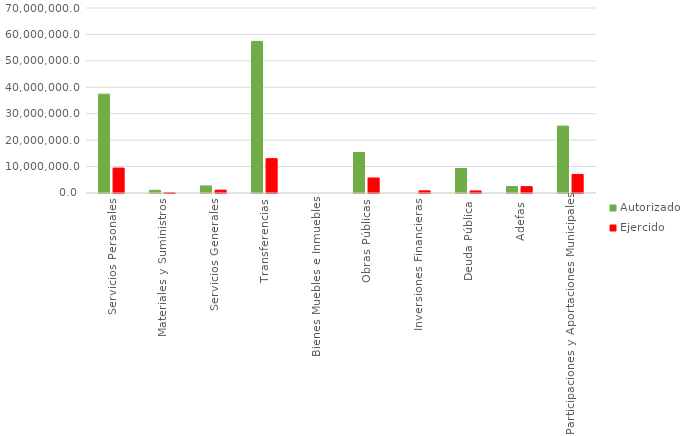
| Category | Autorizado | Ejercido |
|---|---|---|
| Servicios Personales | 37400976 | 9426853 |
| Materiales y Suministros | 1007654.6 | 62169 |
| Servicios Generales | 2671441.9 | 1088884.9 |
| Transferencias | 57359240.2 | 12991305.7 |
| Bienes Muebles e Inmuebles | 0 | 0 |
| Obras Públicas | 15340179.3 | 5679096.3 |
| Inversiones Financieras | 0 | 821471 |
| Deuda Pública | 9250255.7 | 777157.5 |
| Adefas | 2460661.3 | 2395757.3 |
| Participaciones y Aportaciones Municipales | 25313146.3 | 7040380.4 |